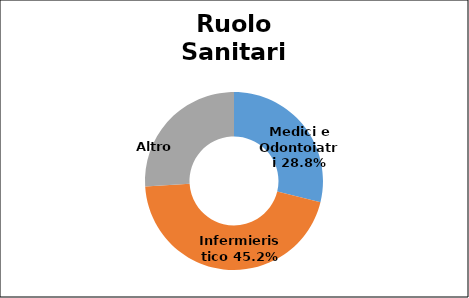
| Category | Series 0 |
|---|---|
| Medici e Odontoiatri | 0.288 |
| Infermieristico | 0.452 |
| Altro  | 0.26 |